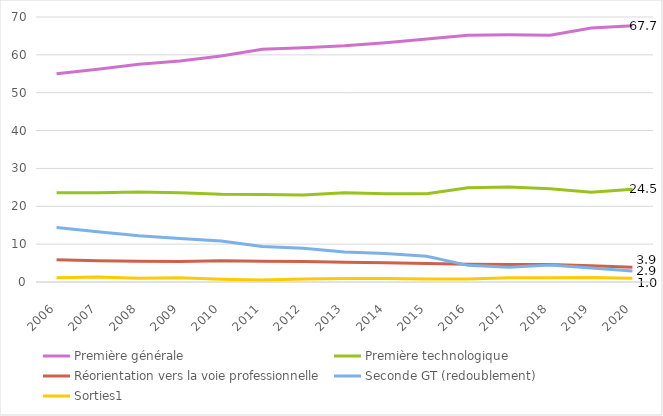
| Category | Première générale       | Première technologique          | Réorientation vers la voie professionnelle | Seconde GT (redoublement)    | Sorties1 |
|---|---|---|---|---|---|
| 2006.0 | 55 | 23.6 | 5.9 | 14.4 | 1.1 |
| 2007.0 | 56.2 | 23.6 | 5.6 | 13.3 | 1.3 |
| 2008.0 | 57.5 | 23.8 | 5.5 | 12.2 | 1 |
| 2009.0 | 58.4 | 23.6 | 5.4 | 11.5 | 1.1 |
| 2010.0 | 59.7 | 23.2 | 5.6 | 10.8 | 0.7 |
| 2011.0 | 61.5 | 23.1 | 5.5 | 9.4 | 0.5 |
| 2012.0 | 61.9 | 23 | 5.4 | 8.9 | 0.8 |
| 2013.0 | 62.4 | 23.6 | 5.2 | 7.9 | 0.9 |
| 2014.0 | 63.2 | 23.3 | 5.1 | 7.5 | 0.9 |
| 2015.0 | 64.2 | 23.3 | 4.9 | 6.8 | 0.8 |
| 2016.0 | 65.2 | 24.9 | 4.7 | 4.4 | 0.8 |
| 2017.0 | 65.3 | 25.1 | 4.6 | 3.9 | 1.1 |
| 2018.0 | 65.2 | 24.6 | 4.6 | 4.5 | 1.1 |
| 2019.0 | 67.1 | 23.7 | 4.3 | 3.7 | 1.2 |
| 2020.0 | 67.7 | 24.5 | 3.9 | 2.9 | 1 |